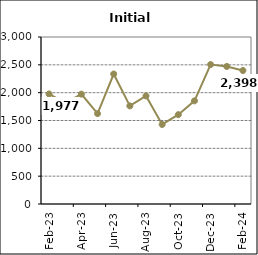
| Category | Series 0 |
|---|---|
| 2023-02-01 | 1977 |
| 2023-03-01 | 1814 |
| 2023-04-01 | 1974 |
| 2023-05-01 | 1623 |
| 2023-06-01 | 2335 |
| 2023-07-01 | 1762 |
| 2023-08-01 | 1942 |
| 2023-09-01 | 1429 |
| 2023-10-01 | 1605 |
| 2023-11-01 | 1853 |
| 2023-12-01 | 2505 |
| 2024-01-01 | 2471 |
| 2024-02-01 | 2398 |